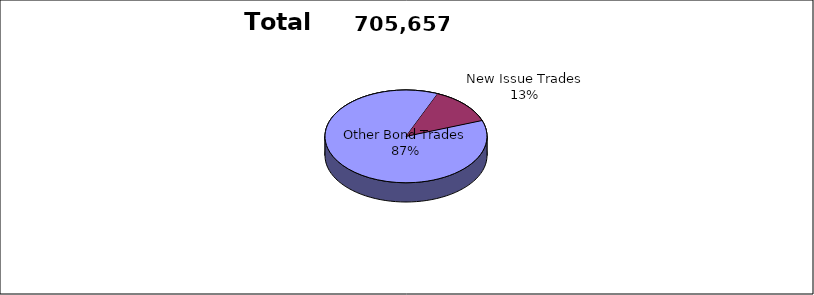
| Category | Series 0 |
|---|---|
| Other Bond Trades | 613618 |
| New Issue Trades | 92039 |